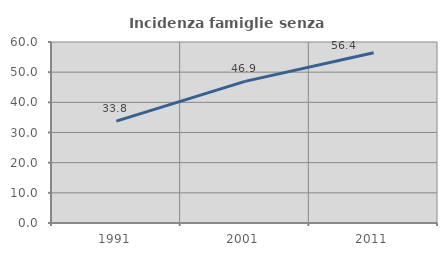
| Category | Incidenza famiglie senza nuclei |
|---|---|
| 1991.0 | 33.784 |
| 2001.0 | 46.939 |
| 2011.0 | 56.436 |